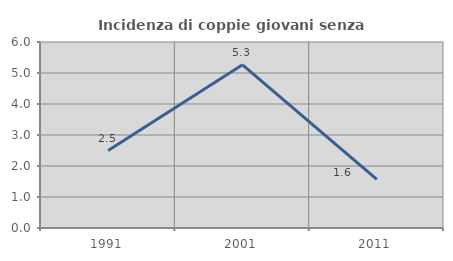
| Category | Incidenza di coppie giovani senza figli |
|---|---|
| 1991.0 | 2.5 |
| 2001.0 | 5.263 |
| 2011.0 | 1.571 |